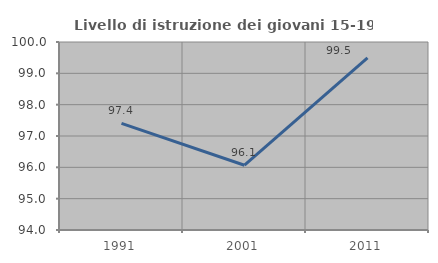
| Category | Livello di istruzione dei giovani 15-19 anni |
|---|---|
| 1991.0 | 97.403 |
| 2001.0 | 96.067 |
| 2011.0 | 99.495 |